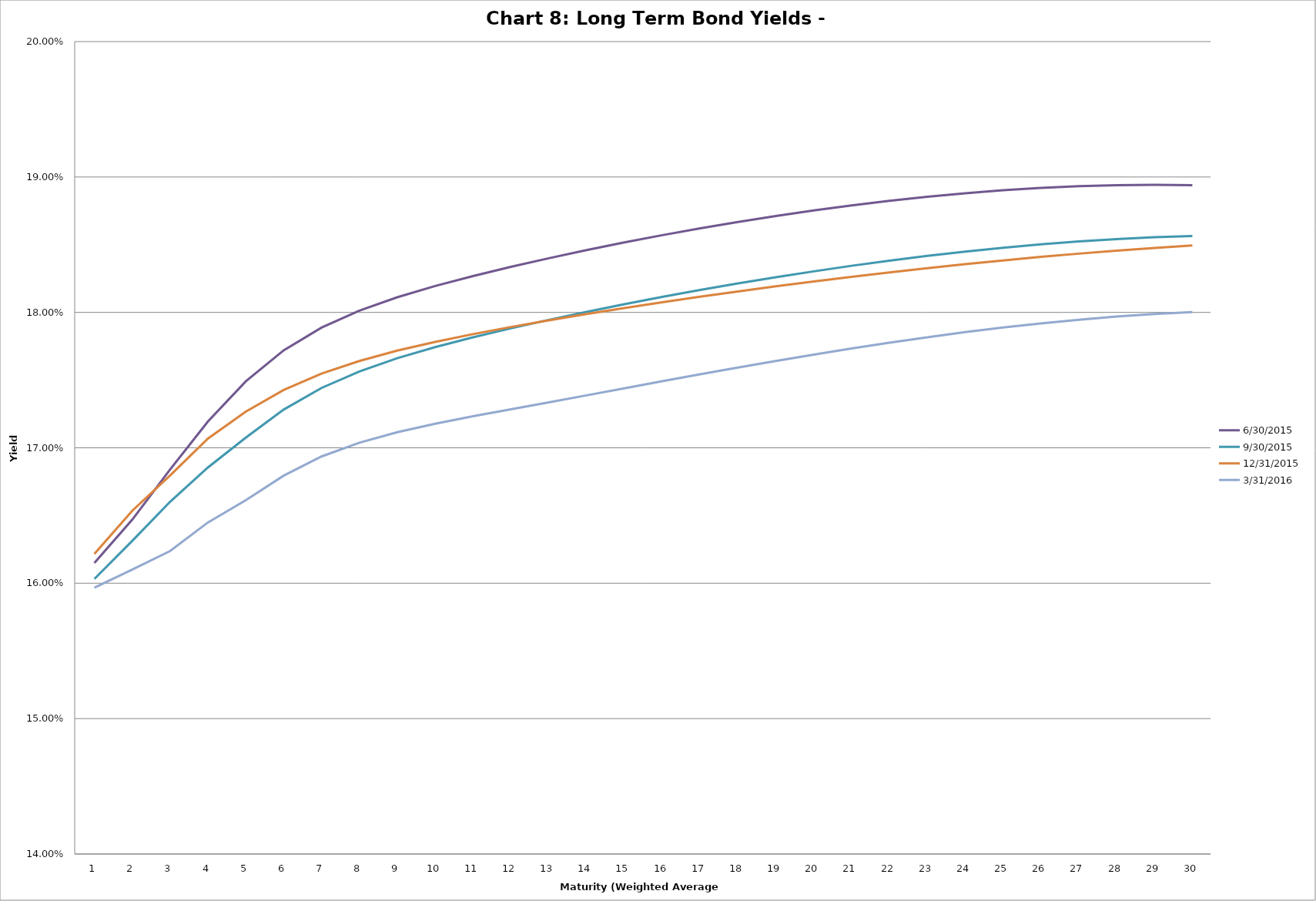
| Category | 6/30/2015 | 9/30/2015 | 12/31/2015 | 3/31/2016 |
|---|---|---|---|---|
| 0 | 0.161 | 0.16 | 0.162 | 0.16 |
| 1 | 0.165 | 0.163 | 0.165 | 0.161 |
| 2 | 0.168 | 0.166 | 0.168 | 0.162 |
| 3 | 0.172 | 0.169 | 0.171 | 0.164 |
| 4 | 0.175 | 0.171 | 0.173 | 0.166 |
| 5 | 0.177 | 0.173 | 0.174 | 0.168 |
| 6 | 0.179 | 0.174 | 0.175 | 0.169 |
| 7 | 0.18 | 0.176 | 0.176 | 0.17 |
| 8 | 0.181 | 0.177 | 0.177 | 0.171 |
| 9 | 0.182 | 0.177 | 0.178 | 0.172 |
| 10 | 0.183 | 0.178 | 0.178 | 0.172 |
| 11 | 0.183 | 0.179 | 0.179 | 0.173 |
| 12 | 0.184 | 0.179 | 0.179 | 0.173 |
| 13 | 0.185 | 0.18 | 0.18 | 0.174 |
| 14 | 0.185 | 0.181 | 0.18 | 0.174 |
| 15 | 0.186 | 0.181 | 0.181 | 0.175 |
| 16 | 0.186 | 0.182 | 0.181 | 0.175 |
| 17 | 0.187 | 0.182 | 0.182 | 0.176 |
| 18 | 0.187 | 0.183 | 0.182 | 0.176 |
| 19 | 0.188 | 0.183 | 0.182 | 0.177 |
| 20 | 0.188 | 0.183 | 0.183 | 0.177 |
| 21 | 0.188 | 0.184 | 0.183 | 0.178 |
| 22 | 0.189 | 0.184 | 0.183 | 0.178 |
| 23 | 0.189 | 0.184 | 0.184 | 0.179 |
| 24 | 0.189 | 0.185 | 0.184 | 0.179 |
| 25 | 0.189 | 0.185 | 0.184 | 0.179 |
| 26 | 0.189 | 0.185 | 0.184 | 0.179 |
| 27 | 0.189 | 0.185 | 0.185 | 0.18 |
| 28 | 0.189 | 0.186 | 0.185 | 0.18 |
| 29 | 0.189 | 0.186 | 0.185 | 0.18 |